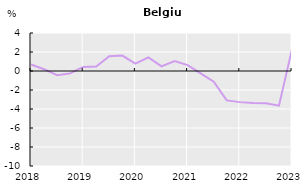
| Category | Basic wage (all sectors) | Basic wage (private sector) | Wage incl. Lump sums and special payments (all sectors) | Wage incl. Lump sums and special payments (private sector) |
|---|---|---|---|---|
| 2018.0 |  | 0.686 |  |  |
| nan |  | 0.19 |  |  |
| nan |  | -0.449 |  |  |
| nan |  | -0.251 |  |  |
| 2019.0 |  | 0.427 |  |  |
| nan |  | 0.469 |  |  |
| nan |  | 1.544 |  |  |
| nan |  | 1.619 |  |  |
| 2020.0 |  | 0.779 |  |  |
| nan |  | 1.425 |  |  |
| nan |  | 0.487 |  |  |
| nan |  | 1.037 |  |  |
| 2021.0 |  | 0.623 |  |  |
| nan |  | -0.249 |  |  |
| nan |  | -1.118 |  |  |
| nan |  | -3.096 |  |  |
| 2022.0 |  | -3.276 |  |  |
| nan |  | -3.356 |  |  |
| nan |  | -3.392 |  |  |
| nan |  | -3.652 |  |  |
| 2023.0 |  | 2.29 |  |  |